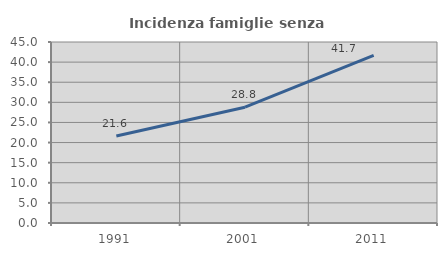
| Category | Incidenza famiglie senza nuclei |
|---|---|
| 1991.0 | 21.644 |
| 2001.0 | 28.786 |
| 2011.0 | 41.689 |